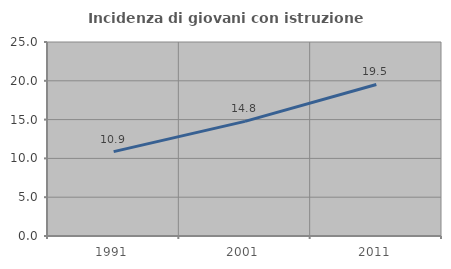
| Category | Incidenza di giovani con istruzione universitaria |
|---|---|
| 1991.0 | 10.87 |
| 2001.0 | 14.769 |
| 2011.0 | 19.526 |